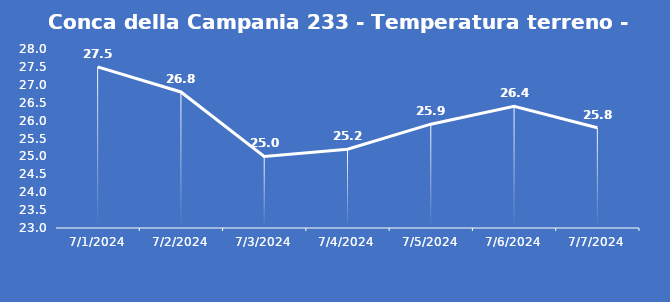
| Category | Conca della Campania 233 - Temperatura terreno - Grezzo (°C) |
|---|---|
| 7/1/24 | 27.5 |
| 7/2/24 | 26.8 |
| 7/3/24 | 25 |
| 7/4/24 | 25.2 |
| 7/5/24 | 25.9 |
| 7/6/24 | 26.4 |
| 7/7/24 | 25.8 |